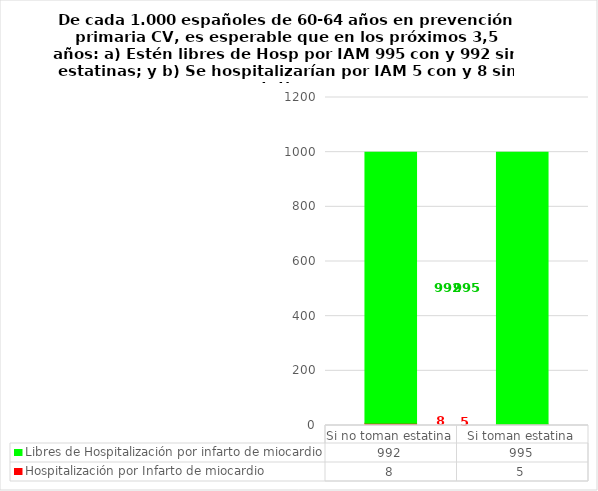
| Category | Hospitalización por Infarto de miocardio | Libres de Hospitalización por infarto de miocardio |
|---|---|---|
| Si no toman estatina | 8 | 992 |
| Si toman estatina | 5 | 995 |